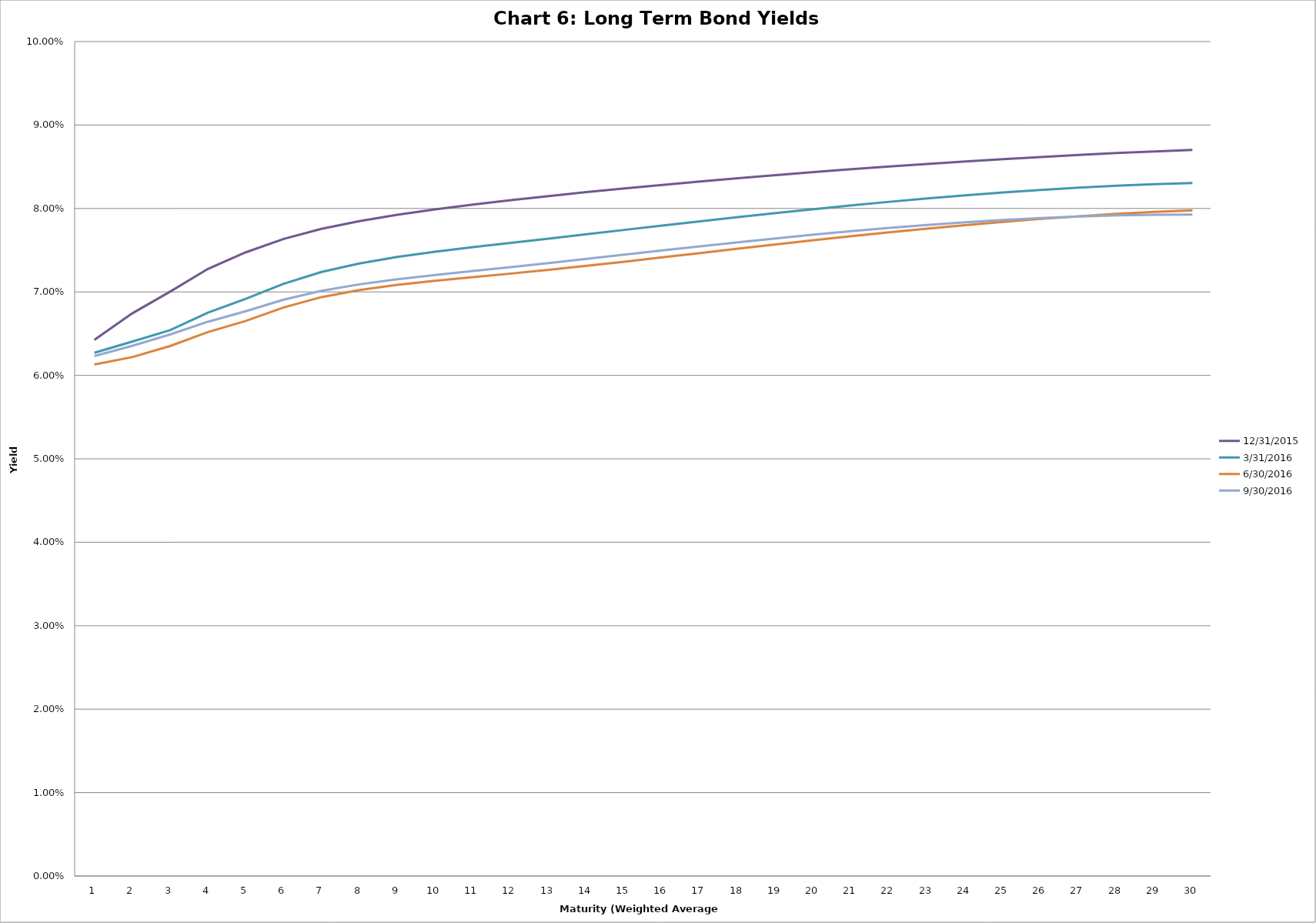
| Category | 12/31/2015 | 3/31/2016 | 6/30/2016 | 9/30/2016 |
|---|---|---|---|---|
| 0 | 0.064 | 0.063 | 0.061 | 0.062 |
| 1 | 0.067 | 0.064 | 0.062 | 0.064 |
| 2 | 0.07 | 0.065 | 0.064 | 0.065 |
| 3 | 0.073 | 0.068 | 0.065 | 0.066 |
| 4 | 0.075 | 0.069 | 0.067 | 0.068 |
| 5 | 0.076 | 0.071 | 0.068 | 0.069 |
| 6 | 0.078 | 0.072 | 0.069 | 0.07 |
| 7 | 0.078 | 0.073 | 0.07 | 0.071 |
| 8 | 0.079 | 0.074 | 0.071 | 0.072 |
| 9 | 0.08 | 0.075 | 0.071 | 0.072 |
| 10 | 0.08 | 0.075 | 0.072 | 0.073 |
| 11 | 0.081 | 0.076 | 0.072 | 0.073 |
| 12 | 0.081 | 0.076 | 0.073 | 0.073 |
| 13 | 0.082 | 0.077 | 0.073 | 0.074 |
| 14 | 0.082 | 0.077 | 0.074 | 0.074 |
| 15 | 0.083 | 0.078 | 0.074 | 0.075 |
| 16 | 0.083 | 0.078 | 0.075 | 0.075 |
| 17 | 0.084 | 0.079 | 0.075 | 0.076 |
| 18 | 0.084 | 0.079 | 0.076 | 0.076 |
| 19 | 0.084 | 0.08 | 0.076 | 0.077 |
| 20 | 0.085 | 0.08 | 0.077 | 0.077 |
| 21 | 0.085 | 0.081 | 0.077 | 0.078 |
| 22 | 0.085 | 0.081 | 0.078 | 0.078 |
| 23 | 0.086 | 0.082 | 0.078 | 0.078 |
| 24 | 0.086 | 0.082 | 0.078 | 0.079 |
| 25 | 0.086 | 0.082 | 0.079 | 0.079 |
| 26 | 0.086 | 0.082 | 0.079 | 0.079 |
| 27 | 0.087 | 0.083 | 0.079 | 0.079 |
| 28 | 0.087 | 0.083 | 0.08 | 0.079 |
| 29 | 0.087 | 0.083 | 0.08 | 0.079 |